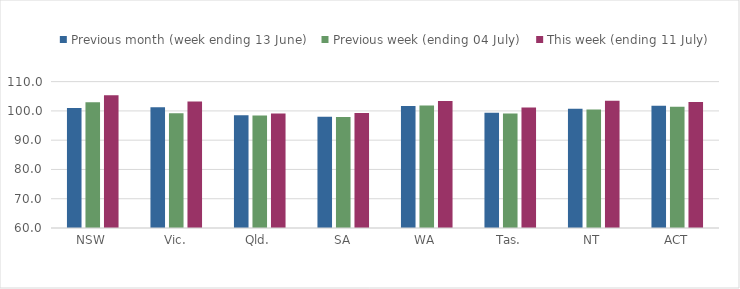
| Category | Previous month (week ending 13 June) | Previous week (ending 04 July) | This week (ending 11 July) |
|---|---|---|---|
| NSW | 101.016 | 102.94 | 105.36 |
| Vic. | 101.263 | 99.237 | 103.215 |
| Qld. | 98.484 | 98.417 | 99.128 |
| SA | 98.043 | 97.889 | 99.321 |
| WA | 101.644 | 101.814 | 103.358 |
| Tas. | 99.397 | 99.095 | 101.18 |
| NT | 100.725 | 100.483 | 103.478 |
| ACT | 101.767 | 101.413 | 103.081 |